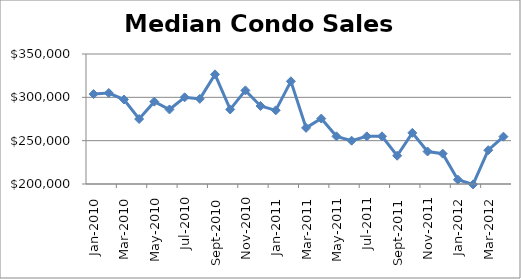
| Category | Series 0 |
|---|---|
| 2010-01-01 | 303750 |
| 2010-02-01 | 305000 |
| 2010-03-01 | 297500 |
| 2010-04-01 | 275000 |
| 2010-05-01 | 295000 |
| 2010-06-01 | 286000 |
| 2010-07-01 | 300000 |
| 2010-08-01 | 298225 |
| 2010-09-01 | 326500 |
| 2010-10-01 | 286000 |
| 2010-11-01 | 308000 |
| 2010-12-01 | 290000 |
| 2011-01-01 | 285000 |
| 2011-02-01 | 318500 |
| 2011-03-01 | 264750 |
| 2011-04-01 | 275500 |
| 2011-05-01 | 255000 |
| 2011-06-01 | 249975 |
| 2011-07-01 | 255000 |
| 2011-08-01 | 255000 |
| 2011-09-01 | 232600 |
| 2011-10-01 | 259000 |
| 2011-11-01 | 237500 |
| 2011-12-01 | 235000 |
| 2012-01-01 | 205000 |
| 2012-02-01 | 199500 |
| 2012-03-01 | 239000 |
| 2012-04-01 | 254625 |